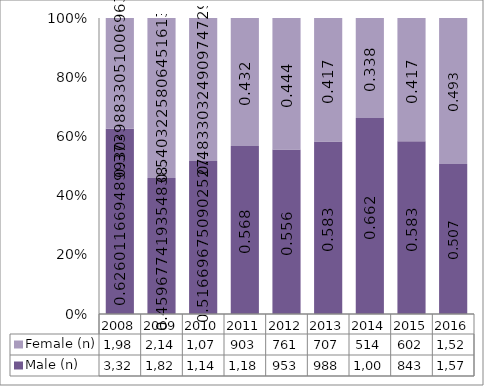
| Category | Male (n) | Female (n) |
|---|---|---|
| 2008.0 | 3326 | 1987 |
| 2009.0 | 1824 | 2144 |
| 2010.0 | 1145 | 1071 |
| 2011.0 | 1187 | 903 |
| 2012.0 | 953 | 761 |
| 2013.0 | 988 | 707 |
| 2014.0 | 1007 | 514 |
| 2015.0 | 843 | 602 |
| 2016.0 | 1572 | 1529 |